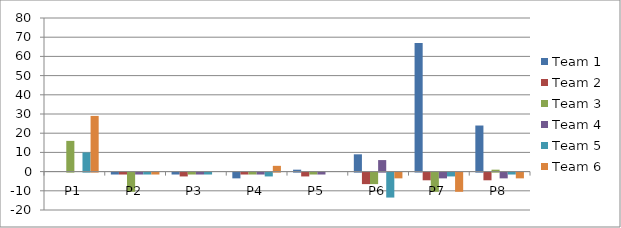
| Category | Team 1 | Team 2 | Team 3 | Team 4 | Team 5 | Team 6 |
|---|---|---|---|---|---|---|
| P1 | 0 | 0 | 16 | 0 | 10 | 29 |
| P2 | -1 | -1 | -10 | -1 | -1 | -1 |
| P3 | -1 | -2 | -1 | -1 | -1 | 0 |
| P4 | -3 | -1 | -1 | -1 | -2 | 3 |
| P5 | 1 | -2 | -1 | -1 | 0 | 0 |
| P6 | 9 | -6 | -6 | 6 | -13 | -3 |
| P7 | 67 | -4 | -10 | -3 | -2 | -10 |
| P8 | 24 | -4 | 1 | -3 | -1 | -3 |